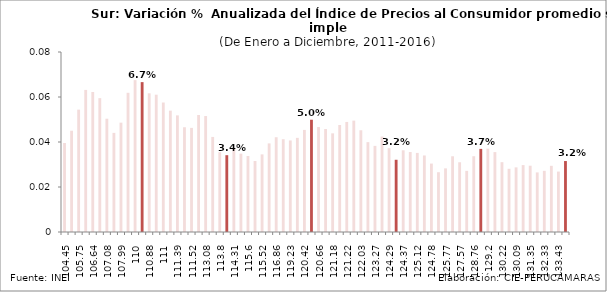
| Category | Series 0 |
|---|---|
| 104.45 | 0.04 |
| 105.06 | 0.045 |
| 105.75 | 0.054 |
| 106.37 | 0.063 |
| 106.64 | 0.062 |
| 106.68 | 0.059 |
| 107.08 | 0.05 |
| 107.3 | 0.044 |
| 107.99 | 0.049 |
| 108.98 | 0.062 |
| 110.0 | 0.067 |
| 110.67 | 0.067 |
| 110.88 | 0.062 |
| 110.84 | 0.061 |
| 111.0 | 0.058 |
| 111.33 | 0.054 |
| 111.39 | 0.052 |
| 111.16 | 0.047 |
| 111.52 | 0.046 |
| 112.4 | 0.052 |
| 113.08 | 0.052 |
| 113.32 | 0.042 |
| 113.8 | 0.035 |
| 113.98 | 0.034 |
| 114.31 | 0.037 |
| 114.49 | 0.035 |
| 115.6 | 0.034 |
| 115.65 | 0.032 |
| 115.52 | 0.034 |
| 116.01 | 0.039 |
| 116.86 | 0.042 |
| 118.27 | 0.041 |
| 119.23 | 0.041 |
| 119.79 | 0.042 |
| 120.42 | 0.045 |
| 120.78 | 0.05 |
| 120.66 | 0.047 |
| 120.93 | 0.046 |
| 121.18 | 0.044 |
| 120.95 | 0.048 |
| 121.22 | 0.049 |
| 121.53 | 0.049 |
| 122.03 | 0.045 |
| 122.47 | 0.04 |
| 123.27 | 0.038 |
| 124.37 | 0.042 |
| 124.29 | 0.037 |
| 123.88 | 0.032 |
| 124.37 | 0.036 |
| 124.82 | 0.036 |
| 125.12 | 0.035 |
| 124.82 | 0.034 |
| 124.78 | 0.03 |
| 125.16 | 0.027 |
| 125.77 | 0.028 |
| 126.86 | 0.034 |
| 127.57 | 0.031 |
| 127.89 | 0.027 |
| 128.76 | 0.034 |
| 128.92 | 0.037 |
| 129.2 | 0.037 |
| 129.52 | 0.036 |
| 130.22 | 0.031 |
| 130.23 | 0.028 |
| 130.09 | 0.029 |
| 130.55 | 0.03 |
| 131.35 | 0.029 |
| 131.72 | 0.026 |
| 132.33 | 0.027 |
| 132.89 | 0.029 |
| 133.43 | 0.027 |
| 133.76 | 0.032 |